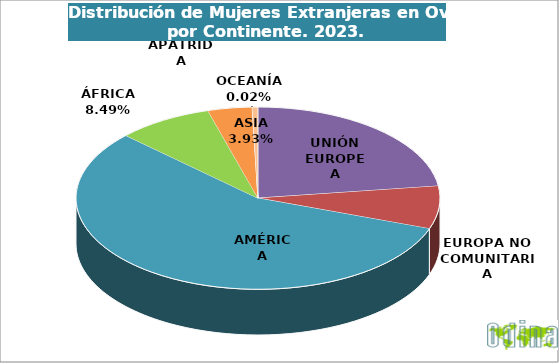
| Category | Mujeres |
|---|---|
| UNIÓN EUROPEA | 2153 |
| EUROPA NO COMUNITARIA | 714 |
| AMÉRICA | 5325 |
| ÁFRICA | 799 |
| ASIA | 370 |
| OCEANÍA | 2 |
| APÁTRIDA | 46 |